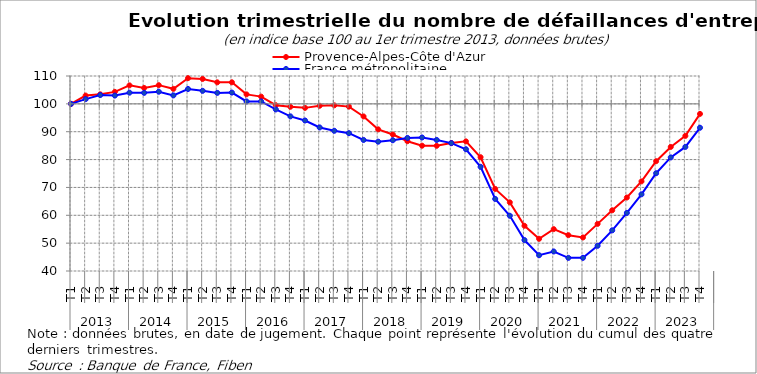
| Category | Provence-Alpes-Côte d'Azur | France métropolitaine |
|---|---|---|
| 0 | 100 | 100 |
| 1 | 102.977 | 101.698 |
| 2 | 103.424 | 103.168 |
| 3 | 104.3 | 102.981 |
| 4 | 106.632 | 104.022 |
| 5 | 105.706 | 103.951 |
| 6 | 106.715 | 104.364 |
| 7 | 105.392 | 103.039 |
| 8 | 109.229 | 105.339 |
| 9 | 108.948 | 104.675 |
| 10 | 107.724 | 103.941 |
| 11 | 107.741 | 104.042 |
| 12 | 103.407 | 100.874 |
| 13 | 102.597 | 100.879 |
| 14 | 99.52 | 98.002 |
| 15 | 98.958 | 95.512 |
| 16 | 98.561 | 94.027 |
| 17 | 99.322 | 91.534 |
| 18 | 99.471 | 90.331 |
| 19 | 99.008 | 89.478 |
| 20 | 95.485 | 87.043 |
| 21 | 90.853 | 86.425 |
| 22 | 88.984 | 86.944 |
| 23 | 86.586 | 87.771 |
| 24 | 84.982 | 87.933 |
| 25 | 84.949 | 87.042 |
| 26 | 85.925 | 85.908 |
| 27 | 86.537 | 83.709 |
| 28 | 80.847 | 77.398 |
| 29 | 69.467 | 65.866 |
| 30 | 64.638 | 59.828 |
| 31 | 56.236 | 51.104 |
| 32 | 51.555 | 45.667 |
| 33 | 55.028 | 47.011 |
| 34 | 52.861 | 44.713 |
| 35 | 52.034 | 44.723 |
| 36 | 56.914 | 49.048 |
| 37 | 61.793 | 54.6 |
| 38 | 66.374 | 60.854 |
| 39 | 72.163 | 67.526 |
| 40 | 79.408 | 75.096 |
| 41 | 84.535 | 80.777 |
| 42 | 88.505 | 84.541 |
| 43 | 96.394 | 91.426 |